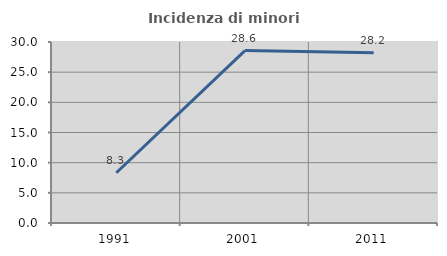
| Category | Incidenza di minori stranieri |
|---|---|
| 1991.0 | 8.333 |
| 2001.0 | 28.571 |
| 2011.0 | 28.205 |